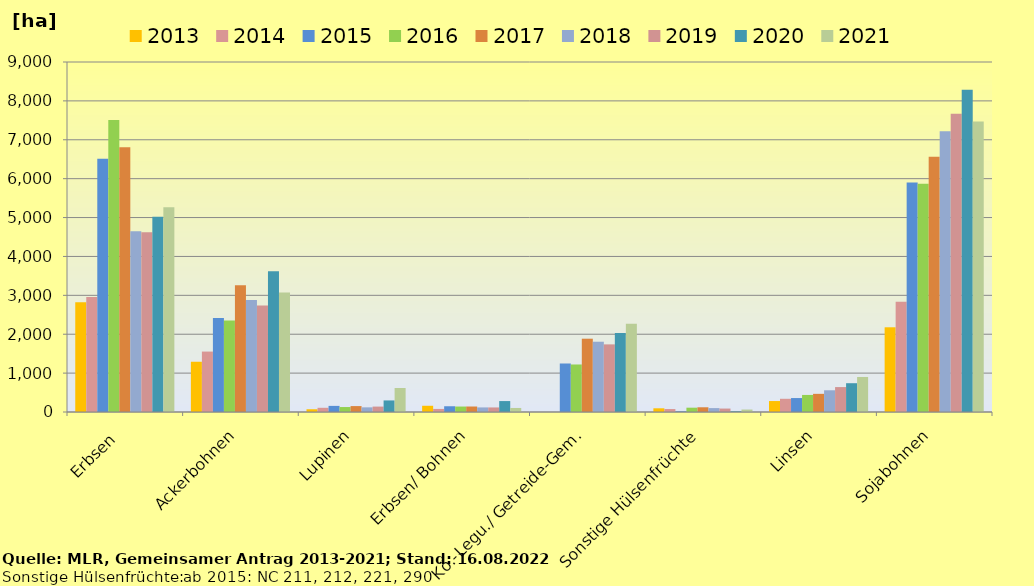
| Category | 2013 | 2014 | 2015 | 2016 | 2017 | 2018 | 2019 | 2020 | 2021 |
|---|---|---|---|---|---|---|---|---|---|
| Erbsen  | 2823.36 | 2954.83 | 6511.45 | 7509.679 | 6808.749 | 4648.367 | 4619.576 | 5021.357 | 5265.615 |
| Ackerbohnen | 1292.1 | 1553.83 | 2415.65 | 2353.534 | 3256.644 | 2880.866 | 2735.614 | 3619.645 | 3073.415 |
| Lupinen | 70.74 | 108.05 | 157.18 | 127.523 | 152.116 | 119.684 | 139.224 | 297.379 | 617.891 |
| Erbsen/ Bohnen | 159.97 | 78.97 | 147.83 | 140.414 | 141.168 | 117.859 | 116.982 | 281.026 | 103.702 |
| Kö.-Legu./ Getreide-Gem. | 0 | 0 | 1247.2 | 1221.812 | 1884.953 | 1807.126 | 1738.748 | 2031.899 | 2266.838 |
| Sonstige Hülsenfrüchte | 95.08 | 76.05 | 17.64 | 111.104 | 121.315 | 100.236 | 88.633 | 17.79 | 63.355 |
| Linsen | 281.82 | 339.71 | 358.5 | 438.498 | 466.843 | 558.506 | 640.725 | 740.426 | 900.874 |
| Sojabohnen | 2178.28 | 2835.54 | 5898.88 | 5866.152 | 6565.257 | 7218.852 | 7668.176 | 8289.442 | 7468.384 |